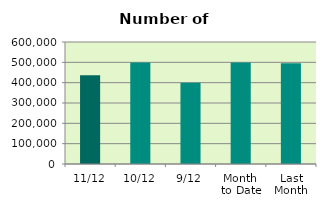
| Category | Series 0 |
|---|---|
| 11/12 | 436800 |
| 10/12 | 499518 |
| 9/12 | 399446 |
| Month 
to Date | 499358.75 |
| Last
Month | 495852.095 |